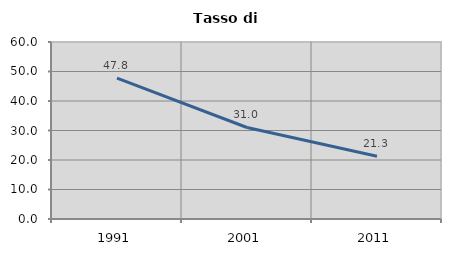
| Category | Tasso di disoccupazione   |
|---|---|
| 1991.0 | 47.767 |
| 2001.0 | 31.026 |
| 2011.0 | 21.287 |